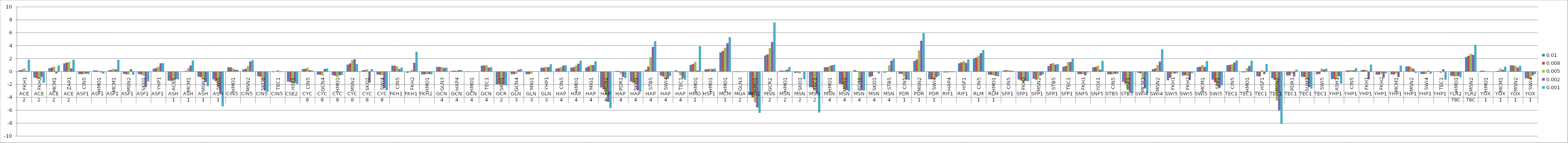
| Category | 0.01 | 0.008 | 0.005 | 0.002 | 0.001 |
|---|---|---|---|---|---|
| 0 | 0.204 | 0.255 | 0.476 | 0.09 | 1.842 |
| 1 | -0.899 | -0.963 | -1.093 | -0.797 | -1.684 |
| 2 | 0.51 | 0.623 | 0.736 | -0.232 | 0.934 |
| 3 | 1.261 | 1.379 | 1.499 | 0.478 | 1.82 |
| 4 | -0.345 | -0.347 | -0.355 | -0.267 | -0.35 |
| 5 | 0.171 | 0.152 | 0.105 | -0.082 | -0.273 |
| 6 | 0.184 | 0.248 | 0.422 | 0.318 | 1.801 |
| 7 | -0.326 | -0.377 | -0.41 | 0.369 | -0.448 |
| 8 | -0.347 | -0.399 | -0.586 | -2.36 | -1.472 |
| 9 | 0.443 | 0.536 | 0.751 | 1.282 | 1.283 |
| 10 | -1.361 | -1.388 | -1.374 | -1.128 | -1.161 |
| 11 | -0.001 | 0.084 | 0.511 | 0.93 | 1.703 |
| 12 | -0.735 | -0.81 | -1.141 | -1.563 | -2.218 |
| 13 | -1.167 | -1.423 | -2.296 | -3.263 | -5.322 |
| 14 | 0.656 | 0.649 | 0.479 | 0.259 | 0.267 |
| 15 | 0.318 | 0.419 | 0.824 | 1.544 | 1.78 |
| 16 | -0.668 | -0.758 | -1.346 | -2.889 | -3.086 |
| 17 | -0.042 | 0.024 | 0.214 | -0.038 | 0.036 |
| 18 | -1.499 | -1.575 | -1.717 | -1.702 | -1.879 |
| 19 | 0.384 | 0.419 | 0.6 | 0.199 | 0.162 |
| 20 | -0.436 | -0.442 | -0.557 | 0.388 | 0.466 |
| 21 | -0.521 | -0.592 | -0.841 | -0.533 | -0.457 |
| 22 | 1.065 | 1.254 | 1.763 | 1.887 | 1.145 |
| 23 | 0.185 | 0.224 | 0.337 | -1.645 | 0.388 |
| 24 | -0.404 | -0.446 | -0.52 | -2.529 | -2.845 |
| 25 | 0.916 | 0.884 | 0.804 | 0.37 | 0.625 |
| 26 | -0.145 | -0.048 | 0.25 | 1.347 | 3.06 |
| 27 | -0.395 | -0.385 | -0.37 | -0.338 | -0.368 |
| 28 | 0.707 | 0.716 | 0.693 | 0.541 | 0.607 |
| 29 | 0.1 | 0.127 | 0.154 | 0.208 | 0.229 |
| 30 | -0.015 | -0.008 | 0.017 | 0.021 | 0.03 |
| 31 | 0.916 | 0.935 | 0.975 | 0.599 | 0.682 |
| 32 | -1.918 | -1.934 | -2.076 | -2.003 | -2.1 |
| 33 | -0.36 | -0.36 | -0.236 | 0.281 | 0.402 |
| 34 | -0.367 | -0.35 | -0.287 | 0.032 | 0.046 |
| 35 | 0.595 | 0.607 | 0.727 | 0.693 | 1.127 |
| 36 | 0.454 | 0.524 | 0.676 | 0.915 | 0.971 |
| 37 | 0.603 | 0.66 | 0.917 | 1.205 | 1.684 |
| 38 | 0.615 | 0.795 | 1.034 | 0.982 | 1.586 |
| 39 | -2.411 | -2.707 | -3.592 | -4.635 | -5.609 |
| 40 | 0.084 | 0.086 | -0.277 | -0.781 | -0.947 |
| 41 | -1.52 | -1.657 | -1.905 | -2.868 | -3.055 |
| 42 | 0.284 | 0.756 | 2.21 | 3.798 | 4.682 |
| 43 | -0.566 | -0.726 | -1.011 | -1.056 | -0.644 |
| 44 | 0.186 | -0.052 | -0.54 | -0.948 | -1.222 |
| 45 | 1.031 | 1.17 | 1.496 | 0.151 | 3.922 |
| 46 | 0.345 | 0.363 | 0.43 | 0.379 | 0.457 |
| 47 | 2.951 | 3.195 | 3.672 | 4.381 | 5.318 |
| 48 | -0.021 | -0.021 | -0.019 | 0 | 0.025 |
| 49 | -3.596 | -3.94 | -4.714 | -5.502 | -6.341 |
| 50 | 2.485 | 2.656 | 3.653 | 4.563 | 7.575 |
| 51 | 0.134 | 0.133 | 0.188 | 0.271 | 0.692 |
| 52 | -0.159 | -0.108 | -0.268 | 0.028 | -1.14 |
| 53 | -2.39 | -2.392 | -2.92 | -3.303 | -6.284 |
| 54 | 0.661 | 0.675 | 0.847 | 0.951 | 1.047 |
| 55 | -1.844 | -1.939 | -2.638 | -2.825 | -3.004 |
| 56 | 0.231 | 0.078 | -1.551 | -2.836 | -2.877 |
| 57 | -0.775 | -0.679 | -0.036 | 0.001 | -0.244 |
| 58 | -0.121 | -0.027 | 0.986 | 1.676 | 1.973 |
| 59 | -0.289 | -0.325 | -0.769 | -1.177 | -1.267 |
| 60 | 1.634 | 1.844 | 3.26 | 4.759 | 5.937 |
| 61 | -1.139 | -1.165 | -1.116 | -0.846 | -0.65 |
| 62 | -0.082 | -0.082 | -0.066 | -0.033 | -0.047 |
| 63 | 1.281 | 1.404 | 1.61 | 1.34 | 1.868 |
| 64 | 2.047 | 2.168 | 2.43 | 2.835 | 3.336 |
| 65 | -0.435 | -0.465 | -0.529 | -0.628 | -0.676 |
| 66 | 0.16 | 0.217 | 0.19 | 0.121 | 0.091 |
| 67 | -1.183 | -1.321 | -1.663 | -1.4 | -1.45 |
| 68 | -1.048 | -1.189 | -0.879 | -0.56 | -0.388 |
| 69 | 0.86 | 1.185 | 1.295 | 1.07 | 1.155 |
| 70 | 0.737 | 0.865 | 1.455 | 1.473 | 2.027 |
| 71 | -0.348 | -0.355 | -0.343 | -0.542 | -0.092 |
| 72 | 0.649 | 0.719 | 0.887 | 0.281 | 1.646 |
| 73 | -0.373 | -0.375 | -0.351 | -0.307 | -0.284 |
| 74 | -1.528 | -1.81 | -2.645 | -3.094 | -3.239 |
| 75 | -0.142 | -0.229 | -1.061 | -2.54 | -3.303 |
| 76 | 0.386 | 0.471 | 1.002 | 1.539 | 3.44 |
| 77 | -1.301 | -0.911 | -0.257 | -0.245 | -0.187 |
| 78 | -0.568 | -0.544 | -0.6 | -1.243 | -0.201 |
| 79 | 0.67 | 0.748 | 0.987 | 0.722 | 1.601 |
| 80 | -1.202 | -1.582 | -2.118 | -2.451 | -2.075 |
| 81 | 0.981 | 1.037 | 1.124 | 1.39 | 1.733 |
| 82 | -0.064 | -0.07 | 0.532 | 0.863 | 1.676 |
| 83 | -0.68 | -0.719 | 0.188 | -0.355 | 1.163 |
| 84 | -0.977 | -1.233 | -4.429 | -5.973 | -8.038 |
| 85 | -0.557 | -0.544 | -0.217 | -0.709 | 0.303 |
| 86 | -0.755 | -0.804 | -1.174 | -2.335 | -2.592 |
| 87 | -0.388 | -0.323 | 0.45 | 0.321 | 0.433 |
| 88 | -1.116 | -1.086 | -1.073 | -0.691 | -1.817 |
| 89 | 0.165 | 0.171 | 0.227 | 0.189 | 0.537 |
| 90 | 0.224 | 0.257 | 0.262 | -1.136 | 1.076 |
| 91 | -0.422 | -0.436 | -0.313 | -0.887 | -0.219 |
| 92 | -0.393 | -0.399 | -0.261 | -0.796 | 0.936 |
| 93 | 0.802 | 0.801 | 0.644 | 0.435 | -0.17 |
| 94 | -0.312 | -0.337 | -0.274 | 0.109 | -0.309 |
| 95 | 0.017 | -0.004 | -0.164 | 0.349 | -1.223 |
| 96 | -0.623 | -0.646 | -0.742 | -0.63 | -0.84 |
| 97 | 2.243 | 2.429 | 2.731 | 2.578 | 4.127 |
| 98 | 0.126 | 0.114 | 0.056 | -0.002 | -0.007 |
| 99 | 0.048 | 0.114 | 0.448 | 0.258 | 0.752 |
| 100 | 0.964 | 0.943 | 0.863 | 0.599 | 0.901 |
| 101 | -0.984 | -1.015 | -1.049 | -0.548 | -0.333 |